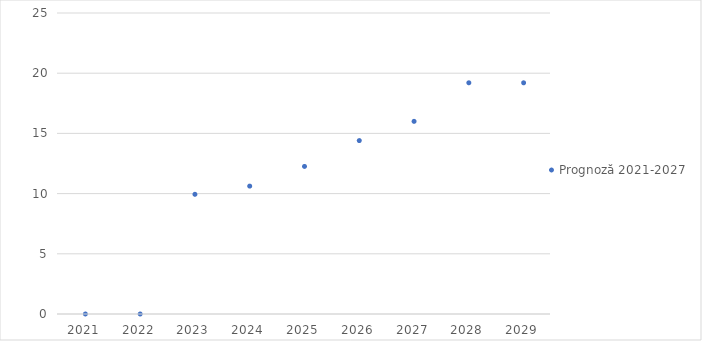
| Category | Prognoză 2021-2027 |
|---|---|
| 2021.0 | 0 |
| 2022.0 | 0 |
| 2023.0 | 9.942 |
| 2024.0 | 10.623 |
| 2025.0 | 12.258 |
| 2026.0 | 14.403 |
| 2027.0 | 16.003 |
| 2028.0 | 19.204 |
| 2029.0 | 19.204 |